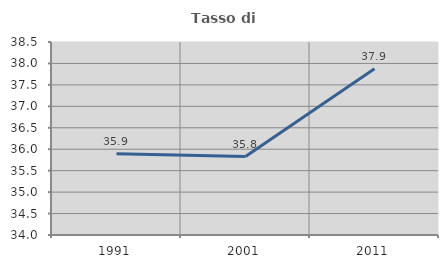
| Category | Tasso di occupazione   |
|---|---|
| 1991.0 | 35.892 |
| 2001.0 | 35.828 |
| 2011.0 | 37.877 |